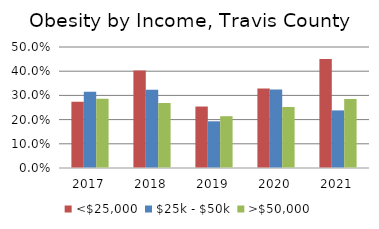
| Category | <$25,000 | $25k - $50k | >$50,000 |
|---|---|---|---|
| 2017.0 | 0.274 | 0.315 | 0.286 |
| 2018.0 | 0.403 | 0.323 | 0.269 |
| 2019.0 | 0.254 | 0.193 | 0.214 |
| 2020.0 | 0.328 | 0.324 | 0.252 |
| 2021.0 | 0.45 | 0.238 | 0.285 |